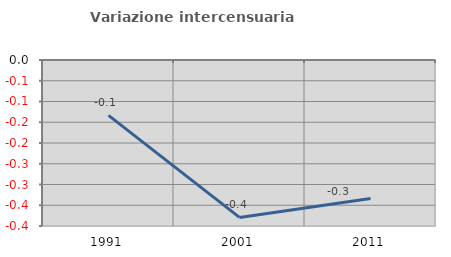
| Category | Variazione intercensuaria annua |
|---|---|
| 1991.0 | -0.133 |
| 2001.0 | -0.379 |
| 2011.0 | -0.334 |